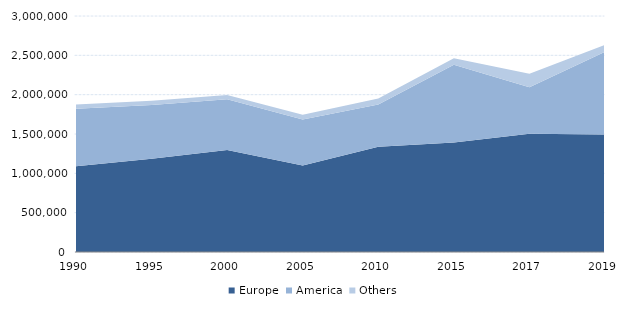
| Category | Europe | America | Others |
|---|---|---|---|
| 1990.0 | 1089715 | 730429 | 53313 |
| 1995.0 | 1184057 | 685649 | 52614 |
| 2000.0 | 1297016 | 644901 | 53469 |
| 2005.0 | 1100491 | 583816 | 60434 |
| 2010.0 | 1336976 | 537339 | 76077 |
| 2015.0 | 1391068 | 990048 | 80354 |
| 2017.0 | 1502151 | 592642 | 171942 |
| 2019.0 | 1493128 | 1051484 | 86947 |